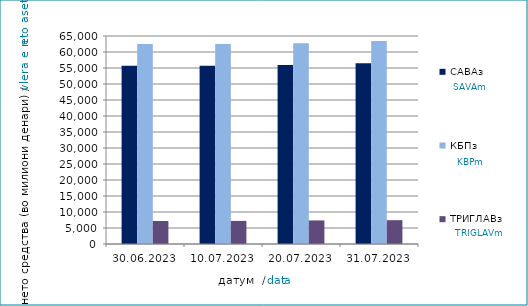
| Category | САВАз | КБПз | ТРИГЛАВз |
|---|---|---|---|
| 2023-06-30 | 55706.211 | 62460.943 | 7180.506 |
| 2023-07-10 | 55742.053 | 62514.453 | 7215.525 |
| 2023-07-20 | 55935.202 | 62748.707 | 7366.153 |
| 2023-07-31 | 56489.14 | 63429.931 | 7445.032 |